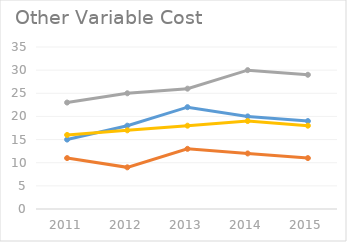
| Category | ACC Ltd | Ambuja Cement | JK Lakshmi Cement | Ultratech Cement |
|---|---|---|---|---|
| 2011 | 15 | 11 | 23 | 16 |
| 2012 | 18 | 9 | 25 | 17 |
| 2013 | 22 | 13 | 26 | 18 |
| 2014 | 20 | 12 | 30 | 19 |
| 2015 | 19 | 11 | 29 | 18 |